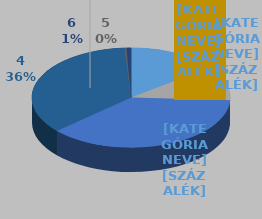
| Category | Series 0 |
|---|---|
| 0 | 78000 |
| 1 | 60000 |
| 2 | 200000 |
| 3 | 190000 |
| 4 | 1500 |
| 5 | 4000 |